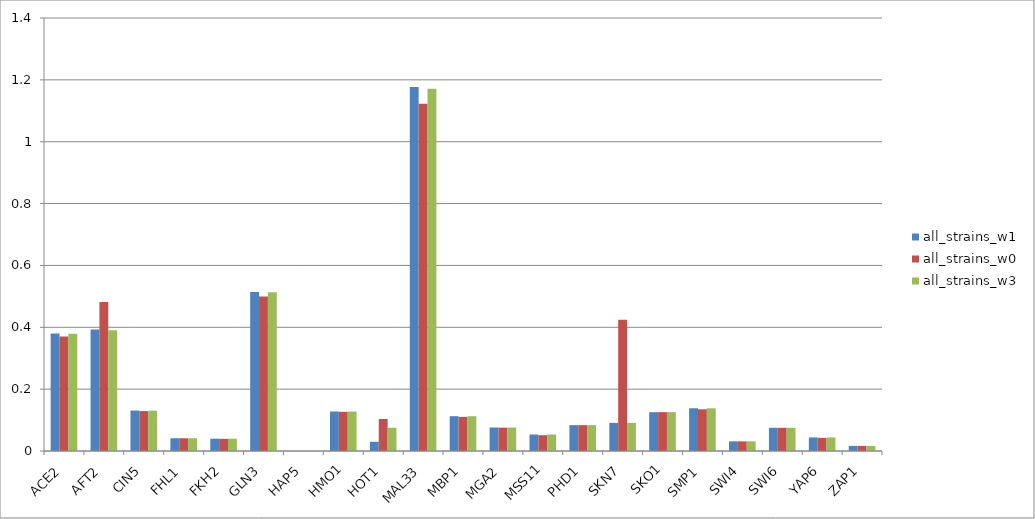
| Category | all_strains_w1 | all_strains_w0 | all_strains_w3 |
|---|---|---|---|
| ACE2 | 0.38 | 0.37 | 0.379 |
| AFT2 | 0.392 | 0.482 | 0.391 |
| CIN5 | 0.131 | 0.129 | 0.13 |
| FHL1 | 0.041 | 0.041 | 0.041 |
| FKH2 | 0.04 | 0.039 | 0.04 |
| GLN3 | 0.514 | 0.499 | 0.513 |
| HAP5 | 0 | 0 | 0 |
| HMO1 | 0.128 | 0.127 | 0.128 |
| HOT1 | 0.03 | 0.103 | 0.075 |
| MAL33 | 1.177 | 1.123 | 1.172 |
| MBP1 | 0.113 | 0.11 | 0.112 |
| MGA2 | 0.076 | 0.075 | 0.076 |
| MSS11 | 0.053 | 0.051 | 0.053 |
| PHD1 | 0.084 | 0.084 | 0.084 |
| SKN7 | 0.091 | 0.425 | 0.091 |
| SKO1 | 0.126 | 0.126 | 0.126 |
| SMP1 | 0.138 | 0.135 | 0.138 |
| SWI4 | 0.031 | 0.031 | 0.031 |
| SWI6 | 0.075 | 0.075 | 0.075 |
| YAP6 | 0.044 | 0.042 | 0.044 |
| ZAP1 | 0.016 | 0.016 | 0.016 |